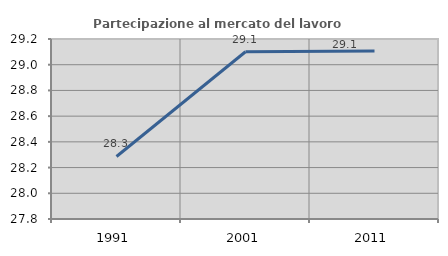
| Category | Partecipazione al mercato del lavoro  femminile |
|---|---|
| 1991.0 | 28.286 |
| 2001.0 | 29.101 |
| 2011.0 | 29.106 |